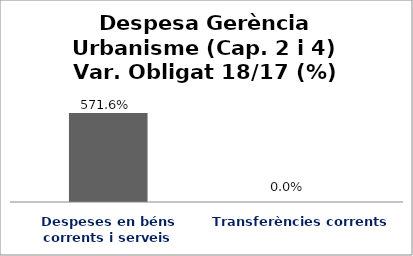
| Category | Series 0 |
|---|---|
| Despeses en béns corrents i serveis | 5.716 |
| Transferències corrents | 0 |